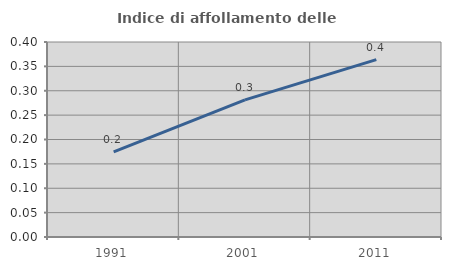
| Category | Indice di affollamento delle abitazioni  |
|---|---|
| 1991.0 | 0.175 |
| 2001.0 | 0.281 |
| 2011.0 | 0.364 |